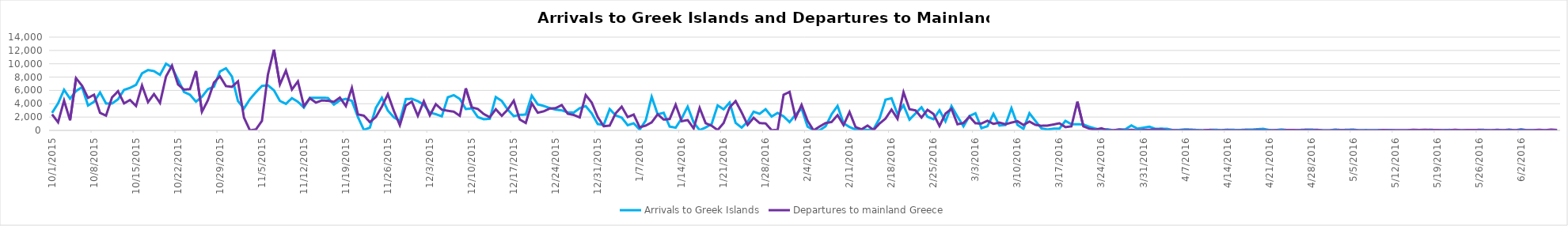
| Category | Arrivals to Greek Islands | Departures to mainland Greece |
|---|---|---|
| 10/1/15 | 2631 | 2409 |
| 10/2/15 | 4055 | 1215 |
| 10/3/15 | 6097 | 4480 |
| 10/4/15 | 4763 | 1513 |
| 10/5/15 | 5909 | 7833 |
| 10/6/15 | 6496 | 6707 |
| 10/7/15 | 3734 | 4886 |
| 10/8/15 | 4295 | 5349 |
| 10/9/15 | 5695 | 2631 |
| 10/10/15 | 4045 | 2214 |
| 10/11/15 | 4034 | 4950 |
| 10/12/15 | 4671 | 5879 |
| 10/13/15 | 6079 | 4052 |
| 10/14/15 | 6380 | 4564 |
| 10/15/15 | 6830 | 3660 |
| 10/16/15 | 8564 | 6743 |
| 10/17/15 | 9063 | 4239 |
| 10/18/15 | 8900 | 5457 |
| 10/19/15 | 8337 | 4119 |
| 10/20/15 | 10006 | 8083 |
| 10/21/15 | 9444 | 9725 |
| 10/22/15 | 7651 | 6896 |
| 10/23/15 | 5762 | 6120 |
| 10/24/15 | 5354 | 6195 |
| 10/25/15 | 4311 | 8916 |
| 10/26/15 | 5049 | 2804 |
| 10/27/15 | 6195 | 4540 |
| 10/28/15 | 6557 | 7191 |
| 10/29/15 | 8847 | 8117 |
| 10/30/15 | 9323 | 6649 |
| 10/31/15 | 8089 | 6537 |
| 11/1/15 | 4400 | 7360 |
| 11/2/15 | 3290 | 1935 |
| 11/3/15 | 4689 | 0 |
| 11/4/15 | 5740 | 142 |
| 11/5/15 | 6679 | 1430 |
| 11/6/15 | 6765 | 8392 |
| 11/7/15 | 6022 | 12116 |
| 11/8/15 | 4425 | 6902 |
| 11/9/15 | 3979 | 8977 |
| 11/10/15 | 4842 | 6133 |
| 11/11/15 | 4296 | 7354 |
| 11/12/15 | 3425 | 3650 |
| 11/13/15 | 4909 | 4820 |
| 11/14/15 | 4884 | 4171 |
| 11/15/15 | 4891 | 4497 |
| 11/16/15 | 4873 | 4442 |
| 11/17/15 | 3873 | 4289 |
| 11/18/15 | 4499 | 4927 |
| 11/19/15 | 4737 | 3644 |
| 11/20/15 | 4432 | 6389 |
| 11/21/15 | 2020 | 2401 |
| 11/22/15 | 76 | 2214 |
| 11/23/15 | 409 | 1245 |
| 11/24/15 | 3383 | 2006 |
| 11/25/15 | 4889 | 3565 |
| 11/26/15 | 2973 | 5435 |
| 11/27/15 | 1961 | 2932 |
| 11/28/15 | 1420 | 778 |
| 11/29/15 | 4703 | 3736 |
| 11/30/15 | 4744 | 4318 |
| 12/1/15 | 4386 | 2181 |
| 12/2/15 | 3863 | 4384 |
| 12/3/15 | 2671 | 2255 |
| 12/4/15 | 2435 | 3934 |
| 12/5/15 | 2110 | 3115 |
| 12/6/15 | 4978 | 2943 |
| 12/7/15 | 5287 | 2810 |
| 12/8/15 | 4721 | 2189 |
| 12/9/15 | 3203 | 6316 |
| 12/10/15 | 3308 | 3456 |
| 12/11/15 | 1999 | 3219 |
| 12/12/15 | 1671 | 2453 |
| 12/13/15 | 1738 | 1976 |
| 12/14/15 | 5005 | 3175 |
| 12/15/15 | 4421 | 2191 |
| 12/16/15 | 3105 | 3137 |
| 12/17/15 | 2135 | 4461 |
| 12/18/15 | 2330 | 1638 |
| 12/19/15 | 2373 | 1110 |
| 12/20/15 | 5223 | 4070 |
| 12/21/15 | 3904 | 2652 |
| 12/22/15 | 3668 | 2864 |
| 12/23/15 | 3354 | 3278 |
| 12/24/15 | 3110 | 3349 |
| 12/25/15 | 3008 | 3806 |
| 12/26/15 | 2710 | 2498 |
| 12/27/15 | 2678 | 2311 |
| 12/28/15 | 3337 | 1946 |
| 12/29/15 | 3643 | 5309 |
| 12/30/15 | 2552 | 4178 |
| 12/31/15 | 948 | 2009 |
| 1/1/16 | 828 | 623 |
| 1/2/16 | 3203 | 720 |
| 1/3/16 | 2241 | 2569 |
| 1/4/16 | 1917 | 3563 |
| 1/5/16 | 779 | 1998 |
| 1/6/16 | 1067 | 2377 |
| 1/7/16 | 119 | 463 |
| 1/8/16 | 1475 | 716 |
| 1/9/16 | 5050 | 1203 |
| 1/10/16 | 2410 | 2417 |
| 1/11/16 | 2645 | 1621 |
| 1/12/16 | 571 | 1701 |
| 1/13/16 | 408 | 3861 |
| 1/14/16 | 1792 | 1378 |
| 1/15/16 | 3564 | 1551 |
| 1/16/16 | 1188 | 301 |
| 1/17/16 | 39 | 3378 |
| 1/18/16 | 435 | 1078 |
| 1/19/16 | 964 | 695 |
| 1/20/16 | 3748 | 50 |
| 1/21/16 | 3166 | 1108 |
| 1/22/16 | 4176 | 3451 |
| 1/23/16 | 1124 | 4397 |
| 1/24/16 | 418 | 2706 |
| 1/25/16 | 1295 | 819 |
| 1/26/16 | 2808 | 1887 |
| 1/27/16 | 2488 | 1098 |
| 1/28/16 | 3180 | 1046 |
| 1/29/16 | 2076 | 40 |
| 1/30/16 | 2623 | 53 |
| 1/31/16 | 2105 | 5342 |
| 2/1/16 | 1244 | 5783 |
| 2/2/16 | 2368 | 1878 |
| 2/3/16 | 3299 | 3829 |
| 2/4/16 | 565 | 1436 |
| 2/5/16 | 38 | 0 |
| 2/6/16 | 7 | 578 |
| 2/7/16 | 608 | 1097 |
| 2/8/16 | 2418 | 1259 |
| 2/9/16 | 3676 | 2283 |
| 2/10/16 | 1071 | 793 |
| 2/11/16 | 502 | 2756 |
| 2/12/16 | 123 | 496 |
| 2/13/16 | 186 | 161 |
| 2/14/16 | 51 | 724 |
| 2/15/16 | 181 | 65 |
| 2/16/16 | 1783 | 1024 |
| 2/17/16 | 4611 | 1772 |
| 2/18/16 | 4824 | 3118 |
| 2/19/16 | 2440 | 1731 |
| 2/20/16 | 3772 | 5738 |
| 2/21/16 | 1618 | 3180 |
| 2/22/16 | 2545 | 3002 |
| 2/23/16 | 3474 | 1927 |
| 2/24/16 | 2044 | 3086 |
| 2/25/16 | 1675 | 2468 |
| 2/26/16 | 3021 | 649 |
| 2/27/16 | 1355 | 2525 |
| 2/28/16 | 3651 | 3234 |
| 2/29/16 | 2072 | 920 |
| 3/1/16 | 609 | 1107 |
| 3/2/16 | 2162 | 2073 |
| 3/3/16 | 2569 | 1061 |
| 3/4/16 | 332 | 1035 |
| 3/5/16 | 630 | 1444 |
| 3/6/16 | 2480 | 980 |
| 3/7/16 | 728 | 1171 |
| 3/8/16 | 811 | 922 |
| 3/9/16 | 3340 | 1169 |
| 3/10/16 | 835 | 1381 |
| 3/11/16 | 232 | 810 |
| 3/12/16 | 2578 | 1326 |
| 3/13/16 | 1418 | 831 |
| 3/14/16 | 301 | 693 |
| 3/15/16 | 128 | 721 |
| 3/16/16 | 252 | 882 |
| 3/17/16 | 263 | 1068 |
| 3/18/16 | 1431 | 489 |
| 3/19/16 | 926 | 608 |
| 3/20/16 | 931 | 4314 |
| 3/21/16 | 880 | 616 |
| 3/22/16 | 539 | 254 |
| 3/23/16 | 269 | 95 |
| 3/24/16 | 83 | 316 |
| 3/25/16 | 177 | 22 |
| 3/26/16 | 5 | 25 |
| 3/27/16 | 144 | 113 |
| 3/28/16 | 161 | 0 |
| 3/29/16 | 741 | 76 |
| 3/30/16 | 267 | 11 |
| 3/31/16 | 401 | 68 |
| 4/1/16 | 555 | 102 |
| 4/2/16 | 231 | 132 |
| 4/3/16 | 262 | 105 |
| 4/4/16 | 228 | 0 |
| 4/5/16 | 28 | 31 |
| 4/6/16 | 70 | 7 |
| 4/7/16 | 157 | 32 |
| 4/8/16 | 116 | 17 |
| 4/9/16 | 59 | 14 |
| 4/10/16 | 0 | 16 |
| 4/11/16 | 75 | 64 |
| 4/12/16 | 101 | 5 |
| 4/13/16 | 30 | 10 |
| 4/14/16 | 106 | 36 |
| 4/15/16 | 79 | 0 |
| 4/16/16 | 55 | 0 |
| 4/17/16 | 107 | 34 |
| 4/18/16 | 107 | 9 |
| 4/19/16 | 178 | 39 |
| 4/20/16 | 233 | 7 |
| 4/21/16 | 49 | 7 |
| 4/22/16 | 34 | 16 |
| 4/23/16 | 137 | 0 |
| 4/24/16 | 52 | 51 |
| 4/25/16 | 0 | 54 |
| 4/26/16 | 62 | 17 |
| 4/27/16 | 108 | 52 |
| 4/28/16 | 110 | 16 |
| 4/29/16 | 90 | 56 |
| 4/30/16 | 0 | 4 |
| 5/1/16 | 0 | 0 |
| 5/2/16 | 123 | 25 |
| 5/3/16 | 53 | 34 |
| 5/4/16 | 87 | 41 |
| 5/5/16 | 123 | 37 |
| 5/6/16 | 14 | 1 |
| 5/7/16 | 48 | 0 |
| 5/8/16 | 37 | 0 |
| 5/9/16 | 42 | 5 |
| 5/10/16 | 63 | 46 |
| 5/11/16 | 73 | 40 |
| 5/12/16 | 11 | 39 |
| 5/13/16 | 6 | 31 |
| 5/14/16 | 8 | 22 |
| 5/15/16 | 47 | 75 |
| 5/16/16 | 16 | 51 |
| 5/17/16 | 24 | 88 |
| 5/18/16 | 98 | 64 |
| 5/19/16 | 14 | 62 |
| 5/20/16 | 35 | 39 |
| 5/21/16 | 76 | 31 |
| 5/22/16 | 50 | 93 |
| 5/23/16 | 6 | 27 |
| 5/24/16 | 0 | 48 |
| 5/25/16 | 1 | 70 |
| 5/26/16 | 104 | 60 |
| 5/27/16 | 68 | 31 |
| 5/28/16 | 2 | 31 |
| 5/29/16 | 97 | 62 |
| 5/30/16 | 14 | 35 |
| 5/31/16 | 125 | 57 |
| 6/1/16 | 7 | 36 |
| 6/2/16 | 173 | 57 |
| 6/3/16 | 15 | 29 |
| 6/4/16 | 20 | 28 |
| 6/5/16 | 0 | 99 |
| 6/6/16 | 18 | 34 |
| 6/7/16 | 56 | 105 |
| 6/8/16 | 8 | 65 |